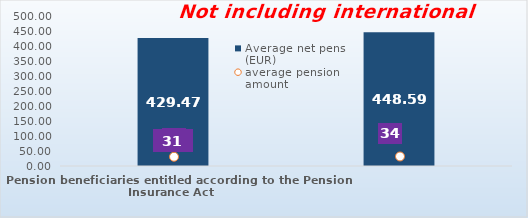
| Category | Average net pension (EUR)  |
|---|---|
| Pension beneficiaries entitled according to the Pension Insurance Act   | 429.47 |
| Pension beneficiaries entitled to pension FOR THE FIRST TIME in 2022 according to the Pension Insurance Act  - NEW BENEFICIARIES | 448.586 |